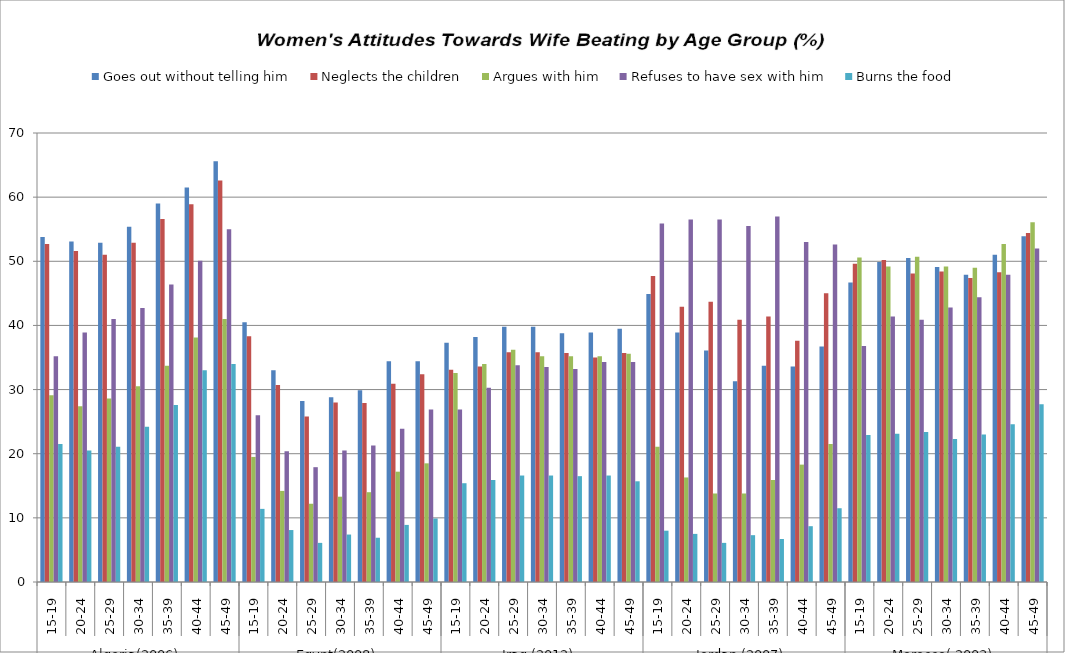
| Category | Goes out without telling him  | Neglects the children  | Argues with him  | Refuses to have sex with him  | Burns the food |
|---|---|---|---|---|---|
| 0 | 53.8 | 52.7 | 29.1 | 35.2 | 21.5 |
| 1 | 53.1 | 51.6 | 27.4 | 38.9 | 20.5 |
| 2 | 52.9 | 51 | 28.6 | 41 | 21.1 |
| 3 | 55.4 | 52.9 | 30.5 | 42.7 | 24.2 |
| 4 | 59 | 56.6 | 33.7 | 46.4 | 27.6 |
| 5 | 61.5 | 58.9 | 38.1 | 50.1 | 33 |
| 6 | 65.6 | 62.6 | 41 | 55 | 34 |
| 7 | 40.5 | 38.3 | 19.5 | 26 | 11.4 |
| 8 | 33 | 30.7 | 14.2 | 20.4 | 8.1 |
| 9 | 28.2 | 25.8 | 12.2 | 17.9 | 6.1 |
| 10 | 28.8 | 28 | 13.3 | 20.5 | 7.4 |
| 11 | 29.9 | 27.9 | 14 | 21.3 | 6.9 |
| 12 | 34.4 | 30.9 | 17.2 | 23.9 | 8.9 |
| 13 | 34.4 | 32.4 | 18.5 | 26.9 | 9.9 |
| 14 | 37.3 | 33.1 | 32.6 | 26.9 | 15.4 |
| 15 | 38.2 | 33.6 | 34 | 30.3 | 15.9 |
| 16 | 39.8 | 35.8 | 36.2 | 33.8 | 16.6 |
| 17 | 39.8 | 35.8 | 35.2 | 33.5 | 16.6 |
| 18 | 38.8 | 35.7 | 35.2 | 33.2 | 16.5 |
| 19 | 38.9 | 35 | 35.2 | 34.3 | 16.6 |
| 20 | 39.5 | 35.7 | 35.6 | 34.3 | 15.7 |
| 21 | 44.9 | 47.7 | 21.1 | 55.9 | 8 |
| 22 | 38.9 | 42.9 | 16.3 | 56.5 | 7.5 |
| 23 | 36.1 | 43.7 | 13.8 | 56.5 | 6.1 |
| 24 | 31.3 | 40.9 | 13.8 | 55.5 | 7.3 |
| 25 | 33.7 | 41.4 | 15.9 | 57 | 6.7 |
| 26 | 33.6 | 37.6 | 18.3 | 53 | 8.7 |
| 27 | 36.7 | 45 | 21.5 | 52.6 | 11.5 |
| 28 | 46.7 | 49.6 | 50.6 | 36.8 | 22.9 |
| 29 | 49.9 | 50.2 | 49.2 | 41.4 | 23.1 |
| 30 | 50.5 | 48.1 | 50.7 | 40.9 | 23.4 |
| 31 | 49.1 | 48.4 | 49.2 | 42.8 | 22.3 |
| 32 | 47.9 | 47.4 | 49 | 44.4 | 23 |
| 33 | 51 | 48.3 | 52.7 | 47.9 | 24.6 |
| 34 | 53.9 | 54.4 | 56.1 | 52 | 27.7 |